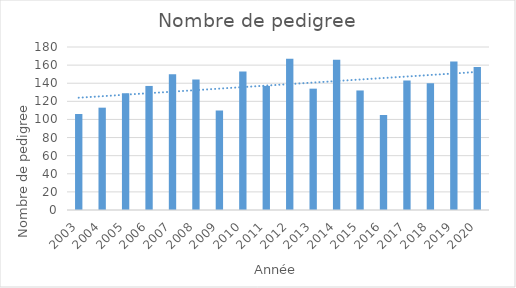
| Category | Series 0 |
|---|---|
| 2003.0 | 106 |
| 2004.0 | 113 |
| 2005.0 | 129 |
| 2006.0 | 137 |
| 2007.0 | 150 |
| 2008.0 | 144 |
| 2009.0 | 110 |
| 2010.0 | 153 |
| 2011.0 | 137 |
| 2012.0 | 167 |
| 2013.0 | 134 |
| 2014.0 | 166 |
| 2015.0 | 132 |
| 2016.0 | 105 |
| 2017.0 | 143 |
| 2018.0 | 140 |
| 2019.0 | 164 |
| 2020.0 | 158 |